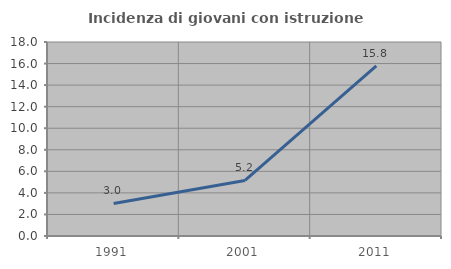
| Category | Incidenza di giovani con istruzione universitaria |
|---|---|
| 1991.0 | 3.025 |
| 2001.0 | 5.155 |
| 2011.0 | 15.777 |